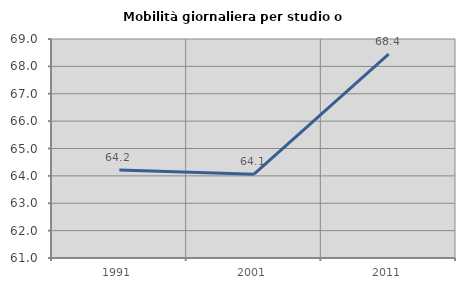
| Category | Mobilità giornaliera per studio o lavoro |
|---|---|
| 1991.0 | 64.213 |
| 2001.0 | 64.06 |
| 2011.0 | 68.447 |